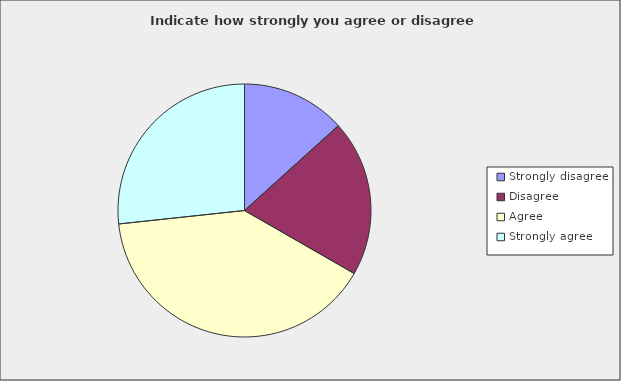
| Category | Series 0 |
|---|---|
| Strongly disagree | 0.133 |
| Disagree | 0.2 |
| Agree | 0.4 |
| Strongly agree | 0.267 |